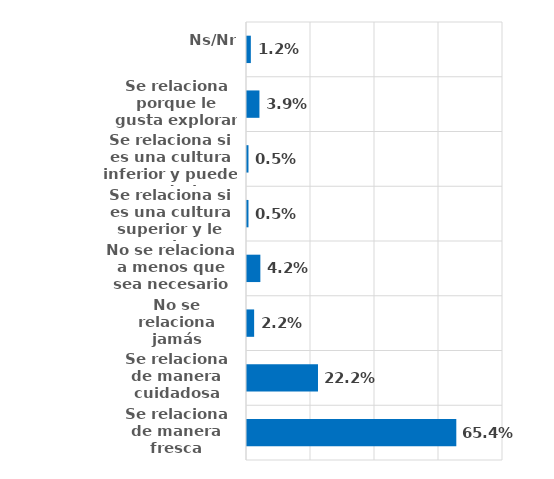
| Category | Series 0 |
|---|---|
| Se relaciona de manera fresca | 0.654 |
| Se relaciona de manera cuidadosa | 0.222 |
| No se relaciona jamás | 0.022 |
| No se relaciona a menos que sea necesario | 0.042 |
| Se relaciona si es una cultura superior y le conviene | 0.005 |
| Se relaciona si es una cultura inferior y puede ayudarle | 0.005 |
| Se relaciona porque le gusta explorar cosas desconocidas | 0.039 |
| Ns/Nr | 0.012 |